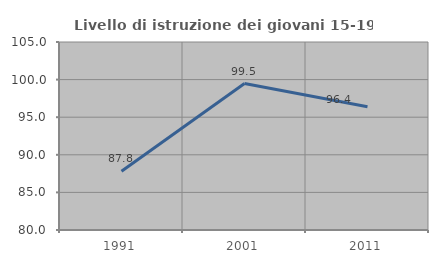
| Category | Livello di istruzione dei giovani 15-19 anni |
|---|---|
| 1991.0 | 87.817 |
| 2001.0 | 99.476 |
| 2011.0 | 96.386 |